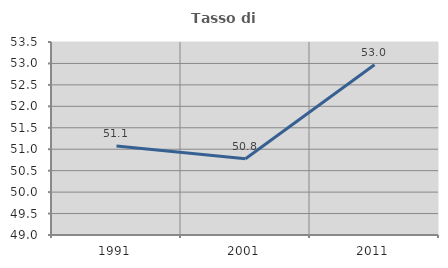
| Category | Tasso di occupazione   |
|---|---|
| 1991.0 | 51.075 |
| 2001.0 | 50.78 |
| 2011.0 | 52.971 |